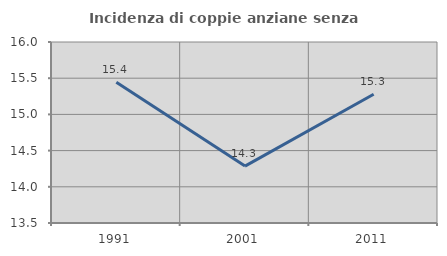
| Category | Incidenza di coppie anziane senza figli  |
|---|---|
| 1991.0 | 15.444 |
| 2001.0 | 14.286 |
| 2011.0 | 15.278 |